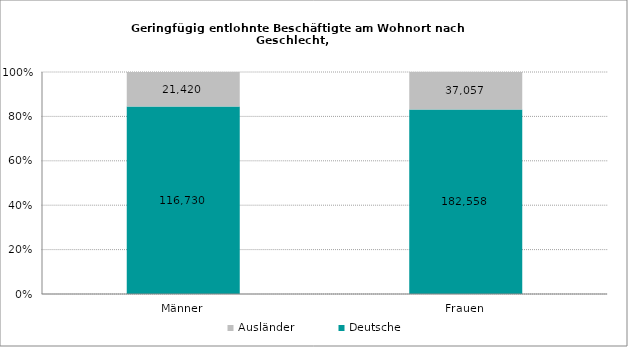
| Category | Deutsche | Ausländer |
|---|---|---|
| Männer | 116730 | 21420 |
| Frauen | 182558 | 37057 |